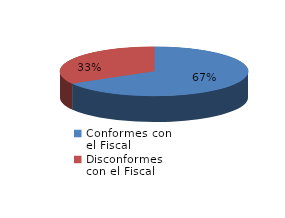
| Category | Series 0 |
|---|---|
| 0 | 22 |
| 1 | 11 |